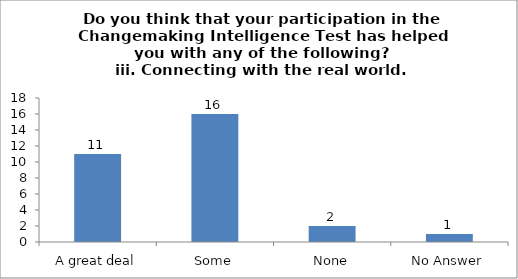
| Category | Do you think that your participation in the Changemaking Intelligence Test has helped you with any of the following?
iii. Connecting with the real world. |
|---|---|
| A great deal | 11 |
| Some | 16 |
| None | 2 |
| No Answer | 1 |